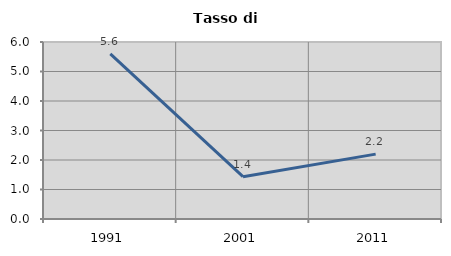
| Category | Tasso di disoccupazione   |
|---|---|
| 1991.0 | 5.596 |
| 2001.0 | 1.435 |
| 2011.0 | 2.199 |